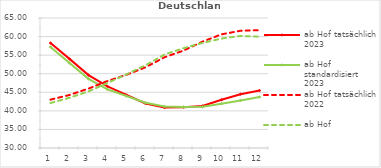
| Category | ab Hof tatsächlich 2023 | ab Hof standardisiert 2023 | ab Hof tatsächlich 2022 | ab Hof standardisiert 2022 |
|---|---|---|---|---|
| 0 | 58.255 | 57.191 | 43.014 | 42.104 |
| 1 | 53.997 | 52.873 | 44.28 | 43.531 |
| 2 | 49.622 | 48.63 | 45.992 | 45.241 |
| 3 | 46.579 | 45.765 | 48.024 | 47.507 |
| 4 | 44.304 | 43.984 | 49.718 | 49.843 |
| 5 | 41.991 | 42.169 | 51.727 | 52.275 |
| 6 | 40.898 | 41.204 | 54.424 | 55.162 |
| 7 | 40.964 | 41.007 | 56.225 | 56.873 |
| 8 | 41.337 | 41.082 | 58.634 | 58.291 |
| 9 | 42.995 | 41.933 | 60.599 | 59.464 |
| 10 | 44.491 | 42.8 | 61.565 | 60.181 |
| 11 | 45.461 | 43.74 | 61.714 | 59.961 |